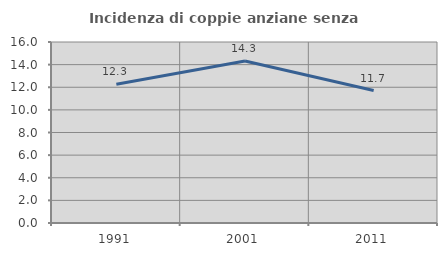
| Category | Incidenza di coppie anziane senza figli  |
|---|---|
| 1991.0 | 12.264 |
| 2001.0 | 14.317 |
| 2011.0 | 11.706 |